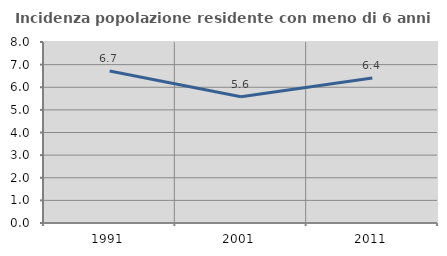
| Category | Incidenza popolazione residente con meno di 6 anni |
|---|---|
| 1991.0 | 6.722 |
| 2001.0 | 5.581 |
| 2011.0 | 6.409 |